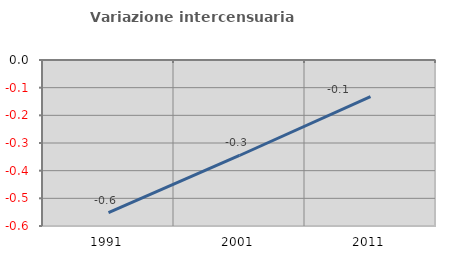
| Category | Variazione intercensuaria annua |
|---|---|
| 1991.0 | -0.552 |
| 2001.0 | -0.345 |
| 2011.0 | -0.133 |